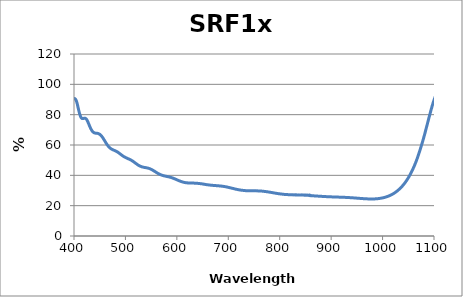
| Category | % Transmission |
|---|---|
| 1150.0 | 61.483 |
| 1149.5 | 62.046 |
| 1149.0 | 62.606 |
| 1148.5 | 63.166 |
| 1148.0 | 63.718 |
| 1147.5 | 64.289 |
| 1147.0 | 64.857 |
| 1146.5 | 65.485 |
| 1146.0 | 66.077 |
| 1145.5 | 66.648 |
| 1145.0 | 67.245 |
| 1144.5 | 67.798 |
| 1144.0 | 68.391 |
| 1143.5 | 69.008 |
| 1143.0 | 69.604 |
| 1142.5 | 70.252 |
| 1142.0 | 70.854 |
| 1141.5 | 71.463 |
| 1141.0 | 72.067 |
| 1140.5 | 72.682 |
| 1140.0 | 73.297 |
| 1139.5 | 73.929 |
| 1139.0 | 74.509 |
| 1138.5 | 75.114 |
| 1138.0 | 75.751 |
| 1137.5 | 76.386 |
| 1137.0 | 77.007 |
| 1136.5 | 77.647 |
| 1136.0 | 78.268 |
| 1135.5 | 78.894 |
| 1135.0 | 79.474 |
| 1134.5 | 80.083 |
| 1134.0 | 80.743 |
| 1133.5 | 81.38 |
| 1133.0 | 81.972 |
| 1132.5 | 82.528 |
| 1132.0 | 83.095 |
| 1131.5 | 83.683 |
| 1131.0 | 84.278 |
| 1130.5 | 84.891 |
| 1130.0 | 85.479 |
| 1129.5 | 86.086 |
| 1129.0 | 86.614 |
| 1128.5 | 87.114 |
| 1128.0 | 87.633 |
| 1127.5 | 88.16 |
| 1127.0 | 88.689 |
| 1126.5 | 89.2 |
| 1126.0 | 89.658 |
| 1125.5 | 90.138 |
| 1125.0 | 90.662 |
| 1124.5 | 91.08 |
| 1124.0 | 91.535 |
| 1123.5 | 91.955 |
| 1123.0 | 92.372 |
| 1122.5 | 92.743 |
| 1122.0 | 93.136 |
| 1121.5 | 93.522 |
| 1121.0 | 93.882 |
| 1120.5 | 94.209 |
| 1120.0 | 94.522 |
| 1119.5 | 94.811 |
| 1119.0 | 95.062 |
| 1118.5 | 95.298 |
| 1118.0 | 95.538 |
| 1117.5 | 95.748 |
| 1117.0 | 95.934 |
| 1116.5 | 96.098 |
| 1116.0 | 96.235 |
| 1115.5 | 96.375 |
| 1115.0 | 96.473 |
| 1114.5 | 96.544 |
| 1114.0 | 96.608 |
| 1113.5 | 96.643 |
| 1113.0 | 96.656 |
| 1112.5 | 96.654 |
| 1112.0 | 96.622 |
| 1111.5 | 96.563 |
| 1111.0 | 96.487 |
| 1110.5 | 96.387 |
| 1110.0 | 96.263 |
| 1109.5 | 96.121 |
| 1109.0 | 95.956 |
| 1108.5 | 95.777 |
| 1108.0 | 95.574 |
| 1107.5 | 95.315 |
| 1107.0 | 95.071 |
| 1106.5 | 94.773 |
| 1106.0 | 94.514 |
| 1105.5 | 94.202 |
| 1105.0 | 93.846 |
| 1104.5 | 93.486 |
| 1104.0 | 93.123 |
| 1103.5 | 92.746 |
| 1103.0 | 92.33 |
| 1102.5 | 91.899 |
| 1102.0 | 91.456 |
| 1101.5 | 91.019 |
| 1101.0 | 90.551 |
| 1100.5 | 90.062 |
| 1100.0 | 89.581 |
| 1099.5 | 89.076 |
| 1099.0 | 88.573 |
| 1098.5 | 88.05 |
| 1098.0 | 87.476 |
| 1097.5 | 86.889 |
| 1097.0 | 86.354 |
| 1096.5 | 85.806 |
| 1096.0 | 85.222 |
| 1095.5 | 84.561 |
| 1095.0 | 83.995 |
| 1094.5 | 83.414 |
| 1094.0 | 82.816 |
| 1093.5 | 82.166 |
| 1093.0 | 81.518 |
| 1092.5 | 80.899 |
| 1092.0 | 80.272 |
| 1091.5 | 79.584 |
| 1091.0 | 78.966 |
| 1090.5 | 78.34 |
| 1090.0 | 77.709 |
| 1089.5 | 77.054 |
| 1089.0 | 76.386 |
| 1088.5 | 75.737 |
| 1088.0 | 75.105 |
| 1087.5 | 74.449 |
| 1087.0 | 73.783 |
| 1086.5 | 73.09 |
| 1086.0 | 72.49 |
| 1085.5 | 71.854 |
| 1085.0 | 71.184 |
| 1084.5 | 70.537 |
| 1084.0 | 69.918 |
| 1083.5 | 69.277 |
| 1083.0 | 68.611 |
| 1082.5 | 67.911 |
| 1082.0 | 67.316 |
| 1081.5 | 66.663 |
| 1081.0 | 66.083 |
| 1080.5 | 65.461 |
| 1080.0 | 64.843 |
| 1079.5 | 64.258 |
| 1079.0 | 63.638 |
| 1078.5 | 63.035 |
| 1078.0 | 62.455 |
| 1077.5 | 61.885 |
| 1077.0 | 61.295 |
| 1076.5 | 60.745 |
| 1076.0 | 60.198 |
| 1075.5 | 59.623 |
| 1075.0 | 59.055 |
| 1074.5 | 58.522 |
| 1074.0 | 57.992 |
| 1073.5 | 57.431 |
| 1073.0 | 56.881 |
| 1072.5 | 56.372 |
| 1072.0 | 55.834 |
| 1071.5 | 55.286 |
| 1071.0 | 54.736 |
| 1070.5 | 54.273 |
| 1070.0 | 53.742 |
| 1069.5 | 53.201 |
| 1069.0 | 52.754 |
| 1068.5 | 52.254 |
| 1068.0 | 51.761 |
| 1067.5 | 51.297 |
| 1067.0 | 50.815 |
| 1066.5 | 50.338 |
| 1066.0 | 49.896 |
| 1065.5 | 49.423 |
| 1065.0 | 48.971 |
| 1064.5 | 48.564 |
| 1064.0 | 48.107 |
| 1063.5 | 47.691 |
| 1063.0 | 47.293 |
| 1062.5 | 46.861 |
| 1062.0 | 46.471 |
| 1061.5 | 46.044 |
| 1061.0 | 45.693 |
| 1060.5 | 45.309 |
| 1060.0 | 44.914 |
| 1059.5 | 44.554 |
| 1059.0 | 44.183 |
| 1058.5 | 43.805 |
| 1058.0 | 43.45 |
| 1057.5 | 43.104 |
| 1057.0 | 42.733 |
| 1056.5 | 42.374 |
| 1056.0 | 42.062 |
| 1055.5 | 41.718 |
| 1055.0 | 41.385 |
| 1054.5 | 41.065 |
| 1054.0 | 40.741 |
| 1053.5 | 40.412 |
| 1053.0 | 40.117 |
| 1052.5 | 39.817 |
| 1052.0 | 39.515 |
| 1051.5 | 39.226 |
| 1051.0 | 38.932 |
| 1050.5 | 38.642 |
| 1050.0 | 38.372 |
| 1049.5 | 38.096 |
| 1049.0 | 37.788 |
| 1048.5 | 37.549 |
| 1048.0 | 37.257 |
| 1047.5 | 36.998 |
| 1047.0 | 36.762 |
| 1046.5 | 36.489 |
| 1046.0 | 36.26 |
| 1045.5 | 36.016 |
| 1045.0 | 35.771 |
| 1044.5 | 35.529 |
| 1044.0 | 35.297 |
| 1043.5 | 35.063 |
| 1043.0 | 34.837 |
| 1042.5 | 34.612 |
| 1042.0 | 34.39 |
| 1041.5 | 34.178 |
| 1041.0 | 33.964 |
| 1040.5 | 33.742 |
| 1040.0 | 33.557 |
| 1039.5 | 33.355 |
| 1039.0 | 33.163 |
| 1038.5 | 32.965 |
| 1038.0 | 32.775 |
| 1037.5 | 32.591 |
| 1037.0 | 32.394 |
| 1036.5 | 32.23 |
| 1036.0 | 32.053 |
| 1035.5 | 31.883 |
| 1035.0 | 31.713 |
| 1034.5 | 31.547 |
| 1034.0 | 31.381 |
| 1033.5 | 31.215 |
| 1033.0 | 31.055 |
| 1032.5 | 30.895 |
| 1032.0 | 30.728 |
| 1031.5 | 30.575 |
| 1031.0 | 30.428 |
| 1030.5 | 30.279 |
| 1030.0 | 30.13 |
| 1029.5 | 29.989 |
| 1029.0 | 29.845 |
| 1028.5 | 29.692 |
| 1028.0 | 29.568 |
| 1027.5 | 29.433 |
| 1027.0 | 29.306 |
| 1026.5 | 29.178 |
| 1026.0 | 29.051 |
| 1025.5 | 28.927 |
| 1025.0 | 28.807 |
| 1024.5 | 28.686 |
| 1024.0 | 28.564 |
| 1023.5 | 28.459 |
| 1023.0 | 28.347 |
| 1022.5 | 28.239 |
| 1022.0 | 28.133 |
| 1021.5 | 28.027 |
| 1021.0 | 27.923 |
| 1020.5 | 27.821 |
| 1020.0 | 27.724 |
| 1019.5 | 27.627 |
| 1019.0 | 27.524 |
| 1018.5 | 27.436 |
| 1018.0 | 27.345 |
| 1017.5 | 27.257 |
| 1017.0 | 27.172 |
| 1016.5 | 27.083 |
| 1016.0 | 27.001 |
| 1015.5 | 26.915 |
| 1015.0 | 26.839 |
| 1014.5 | 26.754 |
| 1014.0 | 26.673 |
| 1013.5 | 26.603 |
| 1013.0 | 26.529 |
| 1012.5 | 26.457 |
| 1012.0 | 26.385 |
| 1011.5 | 26.313 |
| 1011.0 | 26.243 |
| 1010.5 | 26.184 |
| 1010.0 | 26.119 |
| 1009.5 | 26.056 |
| 1009.0 | 25.995 |
| 1008.5 | 25.935 |
| 1008.0 | 25.877 |
| 1007.5 | 25.818 |
| 1007.0 | 25.764 |
| 1006.5 | 25.7 |
| 1006.0 | 25.656 |
| 1005.5 | 25.6 |
| 1005.0 | 25.557 |
| 1004.5 | 25.503 |
| 1004.0 | 25.46 |
| 1003.5 | 25.408 |
| 1003.0 | 25.361 |
| 1002.5 | 25.32 |
| 1002.0 | 25.279 |
| 1001.5 | 25.24 |
| 1001.0 | 25.199 |
| 1000.5 | 25.161 |
| 1000.0 | 25.121 |
| 999.5 | 25.084 |
| 999.0 | 25.051 |
| 998.5 | 25.018 |
| 998.0 | 24.985 |
| 997.5 | 24.953 |
| 997.0 | 24.922 |
| 996.5 | 24.896 |
| 996.0 | 24.866 |
| 995.5 | 24.836 |
| 995.0 | 24.81 |
| 994.5 | 24.787 |
| 994.0 | 24.758 |
| 993.5 | 24.735 |
| 993.0 | 24.711 |
| 992.5 | 24.695 |
| 992.0 | 24.667 |
| 991.5 | 24.651 |
| 991.0 | 24.628 |
| 990.5 | 24.612 |
| 990.0 | 24.59 |
| 989.5 | 24.579 |
| 989.0 | 24.562 |
| 988.5 | 24.549 |
| 988.0 | 24.534 |
| 987.5 | 24.52 |
| 987.0 | 24.512 |
| 986.5 | 24.499 |
| 986.0 | 24.488 |
| 985.5 | 24.476 |
| 985.0 | 24.47 |
| 984.5 | 24.458 |
| 984.0 | 24.453 |
| 983.5 | 24.445 |
| 983.0 | 24.442 |
| 982.5 | 24.434 |
| 982.0 | 24.429 |
| 981.5 | 24.424 |
| 981.0 | 24.422 |
| 980.5 | 24.42 |
| 980.0 | 24.418 |
| 979.5 | 24.414 |
| 979.0 | 24.412 |
| 978.5 | 24.414 |
| 978.0 | 24.415 |
| 977.5 | 24.417 |
| 977.0 | 24.417 |
| 976.5 | 24.418 |
| 976.0 | 24.421 |
| 975.5 | 24.423 |
| 975.0 | 24.427 |
| 974.5 | 24.43 |
| 974.0 | 24.434 |
| 973.5 | 24.44 |
| 973.0 | 24.445 |
| 972.5 | 24.451 |
| 972.0 | 24.457 |
| 971.5 | 24.462 |
| 971.0 | 24.47 |
| 970.5 | 24.477 |
| 970.0 | 24.485 |
| 969.5 | 24.491 |
| 969.0 | 24.501 |
| 968.5 | 24.512 |
| 968.0 | 24.52 |
| 967.5 | 24.529 |
| 967.0 | 24.537 |
| 966.5 | 24.546 |
| 966.0 | 24.557 |
| 965.5 | 24.572 |
| 965.0 | 24.583 |
| 964.5 | 24.592 |
| 964.0 | 24.6 |
| 963.5 | 24.611 |
| 963.0 | 24.625 |
| 962.5 | 24.635 |
| 962.0 | 24.649 |
| 961.5 | 24.661 |
| 961.0 | 24.672 |
| 960.5 | 24.684 |
| 960.0 | 24.696 |
| 959.5 | 24.712 |
| 959.0 | 24.725 |
| 958.5 | 24.734 |
| 958.0 | 24.749 |
| 957.5 | 24.762 |
| 957.0 | 24.776 |
| 956.5 | 24.79 |
| 956.0 | 24.8 |
| 955.5 | 24.813 |
| 955.0 | 24.828 |
| 954.5 | 24.841 |
| 954.0 | 24.855 |
| 953.5 | 24.871 |
| 953.0 | 24.885 |
| 952.5 | 24.901 |
| 952.0 | 24.914 |
| 951.5 | 24.925 |
| 951.0 | 24.937 |
| 950.5 | 24.946 |
| 950.0 | 24.96 |
| 949.5 | 24.973 |
| 949.0 | 24.989 |
| 948.5 | 25.009 |
| 948.0 | 25.017 |
| 947.5 | 25.033 |
| 947.0 | 25.045 |
| 946.5 | 25.054 |
| 946.0 | 25.072 |
| 945.5 | 25.084 |
| 945.0 | 25.099 |
| 944.5 | 25.113 |
| 944.0 | 25.122 |
| 943.5 | 25.136 |
| 943.0 | 25.148 |
| 942.5 | 25.159 |
| 942.0 | 25.173 |
| 941.5 | 25.186 |
| 941.0 | 25.194 |
| 940.5 | 25.207 |
| 940.0 | 25.221 |
| 939.5 | 25.23 |
| 939.0 | 25.239 |
| 938.5 | 25.245 |
| 938.0 | 25.262 |
| 937.5 | 25.271 |
| 937.0 | 25.281 |
| 936.5 | 25.293 |
| 936.0 | 25.302 |
| 935.5 | 25.315 |
| 935.0 | 25.327 |
| 934.5 | 25.338 |
| 934.0 | 25.349 |
| 933.5 | 25.36 |
| 933.0 | 25.37 |
| 932.5 | 25.38 |
| 932.0 | 25.388 |
| 931.5 | 25.395 |
| 931.0 | 25.403 |
| 930.5 | 25.413 |
| 930.0 | 25.422 |
| 929.5 | 25.431 |
| 929.0 | 25.44 |
| 928.5 | 25.447 |
| 928.0 | 25.454 |
| 927.5 | 25.464 |
| 927.0 | 25.472 |
| 926.5 | 25.478 |
| 926.0 | 25.486 |
| 925.5 | 25.496 |
| 925.0 | 25.503 |
| 924.5 | 25.512 |
| 924.0 | 25.517 |
| 923.5 | 25.523 |
| 923.0 | 25.53 |
| 922.5 | 25.54 |
| 922.0 | 25.548 |
| 921.5 | 25.551 |
| 921.0 | 25.556 |
| 920.5 | 25.563 |
| 920.0 | 25.571 |
| 919.5 | 25.579 |
| 919.0 | 25.585 |
| 918.5 | 25.588 |
| 918.0 | 25.593 |
| 917.5 | 25.6 |
| 917.0 | 25.604 |
| 916.5 | 25.611 |
| 916.0 | 25.619 |
| 915.5 | 25.623 |
| 915.0 | 25.629 |
| 914.5 | 25.635 |
| 914.0 | 25.64 |
| 913.5 | 25.643 |
| 913.0 | 25.652 |
| 912.5 | 25.656 |
| 912.0 | 25.664 |
| 911.5 | 25.671 |
| 911.0 | 25.674 |
| 910.5 | 25.677 |
| 910.0 | 25.685 |
| 909.5 | 25.695 |
| 909.0 | 25.7 |
| 908.5 | 25.702 |
| 908.0 | 25.708 |
| 907.5 | 25.719 |
| 907.0 | 25.724 |
| 906.5 | 25.724 |
| 906.0 | 25.732 |
| 905.5 | 25.74 |
| 905.0 | 25.743 |
| 904.5 | 25.752 |
| 904.0 | 25.76 |
| 903.5 | 25.763 |
| 903.0 | 25.77 |
| 902.5 | 25.777 |
| 902.0 | 25.784 |
| 901.5 | 25.792 |
| 901.0 | 25.798 |
| 900.5 | 25.804 |
| 900.0 | 25.811 |
| 899.5 | 25.816 |
| 899.0 | 25.822 |
| 898.5 | 25.83 |
| 898.0 | 25.838 |
| 897.5 | 25.847 |
| 897.0 | 25.852 |
| 896.5 | 25.861 |
| 896.0 | 25.869 |
| 895.5 | 25.875 |
| 895.0 | 25.883 |
| 894.5 | 25.891 |
| 894.0 | 25.899 |
| 893.5 | 25.905 |
| 893.0 | 25.914 |
| 892.5 | 25.925 |
| 892.0 | 25.934 |
| 891.5 | 25.943 |
| 891.0 | 25.952 |
| 890.5 | 25.959 |
| 890.0 | 25.968 |
| 889.5 | 25.975 |
| 889.0 | 25.986 |
| 888.5 | 25.996 |
| 888.0 | 26.006 |
| 887.5 | 26.015 |
| 887.0 | 26.025 |
| 886.5 | 26.034 |
| 886.0 | 26.042 |
| 885.5 | 26.055 |
| 885.0 | 26.066 |
| 884.5 | 26.071 |
| 884.0 | 26.082 |
| 883.5 | 26.09 |
| 883.0 | 26.106 |
| 882.5 | 26.114 |
| 882.0 | 26.125 |
| 881.5 | 26.136 |
| 881.0 | 26.146 |
| 880.5 | 26.156 |
| 880.0 | 26.167 |
| 879.5 | 26.178 |
| 879.0 | 26.189 |
| 878.5 | 26.2 |
| 878.0 | 26.21 |
| 877.5 | 26.22 |
| 877.0 | 26.233 |
| 876.5 | 26.244 |
| 876.0 | 26.254 |
| 875.5 | 26.264 |
| 875.0 | 26.274 |
| 874.5 | 26.289 |
| 874.0 | 26.299 |
| 873.5 | 26.31 |
| 873.0 | 26.319 |
| 872.5 | 26.332 |
| 872.0 | 26.343 |
| 871.5 | 26.353 |
| 871.0 | 26.365 |
| 870.5 | 26.376 |
| 870.0 | 26.388 |
| 869.5 | 26.397 |
| 869.0 | 26.407 |
| 868.5 | 26.423 |
| 868.0 | 26.431 |
| 867.5 | 26.442 |
| 867.0 | 26.453 |
| 866.5 | 26.463 |
| 866.0 | 26.477 |
| 865.5 | 26.485 |
| 865.0 | 26.495 |
| 864.5 | 26.505 |
| 864.0 | 26.518 |
| 863.5 | 26.527 |
| 863.0 | 26.536 |
| 862.5 | 26.543 |
| 862.0 | 26.559 |
| 861.5 | 26.567 |
| 861.0 | 26.572 |
| 860.5 | 26.764 |
| 860.0 | 26.804 |
| 859.5 | 26.779 |
| 859.0 | 26.565 |
| 858.5 | 26.694 |
| 858.0 | 27.009 |
| 857.5 | 26.879 |
| 857.0 | 26.739 |
| 856.5 | 26.954 |
| 856.0 | 26.832 |
| 855.5 | 26.874 |
| 855.0 | 26.87 |
| 854.5 | 26.96 |
| 854.0 | 26.887 |
| 853.5 | 26.994 |
| 853.0 | 26.922 |
| 852.5 | 26.975 |
| 852.0 | 26.888 |
| 851.5 | 26.864 |
| 851.0 | 26.897 |
| 850.5 | 27.018 |
| 850.0 | 26.976 |
| 849.5 | 26.921 |
| 849.0 | 26.925 |
| 848.5 | 26.996 |
| 848.0 | 26.9 |
| 847.5 | 26.949 |
| 847.0 | 27.04 |
| 846.5 | 27.029 |
| 846.0 | 26.935 |
| 845.5 | 27.014 |
| 845.0 | 27.122 |
| 844.5 | 27.004 |
| 844.0 | 27.004 |
| 843.5 | 26.955 |
| 843.0 | 26.997 |
| 842.5 | 27.148 |
| 842.0 | 27.007 |
| 841.5 | 27.091 |
| 841.0 | 27.039 |
| 840.5 | 27.071 |
| 840.0 | 27.061 |
| 839.5 | 27.016 |
| 839.0 | 27.067 |
| 838.5 | 27.011 |
| 838.0 | 27.066 |
| 837.5 | 27.059 |
| 837.0 | 27.121 |
| 836.5 | 27.038 |
| 836.0 | 27.002 |
| 835.5 | 27.06 |
| 835.0 | 27.096 |
| 834.5 | 27.085 |
| 834.0 | 27.051 |
| 833.5 | 27.034 |
| 833.0 | 27.121 |
| 832.5 | 27.099 |
| 832.0 | 27.129 |
| 831.5 | 27.092 |
| 831.0 | 27.127 |
| 830.5 | 27.092 |
| 830.0 | 27.168 |
| 829.5 | 27.122 |
| 829.0 | 27.144 |
| 828.5 | 27.1 |
| 828.0 | 27.097 |
| 827.5 | 27.127 |
| 827.0 | 27.137 |
| 826.5 | 27.117 |
| 826.0 | 27.103 |
| 825.5 | 27.13 |
| 825.0 | 27.12 |
| 824.5 | 27.124 |
| 824.0 | 27.151 |
| 823.5 | 27.168 |
| 823.0 | 27.165 |
| 822.5 | 27.196 |
| 822.0 | 27.203 |
| 821.5 | 27.203 |
| 821.0 | 27.201 |
| 820.5 | 27.167 |
| 820.0 | 27.199 |
| 819.5 | 27.196 |
| 819.0 | 27.208 |
| 818.5 | 27.218 |
| 818.0 | 27.272 |
| 817.5 | 27.241 |
| 817.0 | 27.258 |
| 816.5 | 27.261 |
| 816.0 | 27.259 |
| 815.5 | 27.297 |
| 815.0 | 27.293 |
| 814.5 | 27.335 |
| 814.0 | 27.313 |
| 813.5 | 27.313 |
| 813.0 | 27.358 |
| 812.5 | 27.369 |
| 812.0 | 27.378 |
| 811.5 | 27.395 |
| 811.0 | 27.402 |
| 810.5 | 27.438 |
| 810.0 | 27.42 |
| 809.5 | 27.413 |
| 809.0 | 27.422 |
| 808.5 | 27.449 |
| 808.0 | 27.473 |
| 807.5 | 27.494 |
| 807.0 | 27.51 |
| 806.5 | 27.525 |
| 806.0 | 27.566 |
| 805.5 | 27.564 |
| 805.0 | 27.603 |
| 804.5 | 27.629 |
| 804.0 | 27.634 |
| 803.5 | 27.636 |
| 803.0 | 27.681 |
| 802.5 | 27.717 |
| 802.0 | 27.725 |
| 801.5 | 27.742 |
| 801.0 | 27.737 |
| 800.5 | 27.794 |
| 800.0 | 27.813 |
| 799.5 | 27.834 |
| 799.0 | 27.861 |
| 798.5 | 27.863 |
| 798.0 | 27.893 |
| 797.5 | 27.914 |
| 797.0 | 27.927 |
| 796.5 | 27.948 |
| 796.0 | 27.992 |
| 795.5 | 28.053 |
| 795.0 | 28.072 |
| 794.5 | 28.089 |
| 794.0 | 28.1 |
| 793.5 | 28.134 |
| 793.0 | 28.165 |
| 792.5 | 28.185 |
| 792.0 | 28.21 |
| 791.5 | 28.249 |
| 791.0 | 28.264 |
| 790.5 | 28.306 |
| 790.0 | 28.333 |
| 789.5 | 28.342 |
| 789.0 | 28.382 |
| 788.5 | 28.418 |
| 788.0 | 28.443 |
| 787.5 | 28.483 |
| 787.0 | 28.505 |
| 786.5 | 28.528 |
| 786.0 | 28.576 |
| 785.5 | 28.6 |
| 785.0 | 28.633 |
| 784.5 | 28.666 |
| 784.0 | 28.7 |
| 783.5 | 28.731 |
| 783.0 | 28.738 |
| 782.5 | 28.778 |
| 782.0 | 28.809 |
| 781.5 | 28.828 |
| 781.0 | 28.869 |
| 780.5 | 28.889 |
| 780.0 | 28.917 |
| 779.5 | 28.96 |
| 779.0 | 28.976 |
| 778.5 | 29.021 |
| 778.0 | 29.064 |
| 777.5 | 29.077 |
| 777.0 | 29.102 |
| 776.5 | 29.121 |
| 776.0 | 29.136 |
| 775.5 | 29.168 |
| 775.0 | 29.201 |
| 774.5 | 29.214 |
| 774.0 | 29.246 |
| 773.5 | 29.268 |
| 773.0 | 29.291 |
| 772.5 | 29.325 |
| 772.0 | 29.339 |
| 771.5 | 29.348 |
| 771.0 | 29.365 |
| 770.5 | 29.383 |
| 770.0 | 29.398 |
| 769.5 | 29.428 |
| 769.0 | 29.447 |
| 768.5 | 29.468 |
| 768.0 | 29.485 |
| 767.5 | 29.49 |
| 767.0 | 29.518 |
| 766.5 | 29.548 |
| 766.0 | 29.569 |
| 765.5 | 29.592 |
| 765.0 | 29.601 |
| 764.5 | 29.604 |
| 764.0 | 29.605 |
| 763.5 | 29.62 |
| 763.0 | 29.655 |
| 762.5 | 29.662 |
| 762.0 | 29.656 |
| 761.5 | 29.667 |
| 761.0 | 29.686 |
| 760.5 | 29.69 |
| 760.0 | 29.701 |
| 759.5 | 29.715 |
| 759.0 | 29.717 |
| 758.5 | 29.709 |
| 758.0 | 29.713 |
| 757.5 | 29.722 |
| 757.0 | 29.746 |
| 756.5 | 29.78 |
| 756.0 | 29.779 |
| 755.5 | 29.771 |
| 755.0 | 29.758 |
| 754.5 | 29.748 |
| 754.0 | 29.766 |
| 753.5 | 29.774 |
| 753.0 | 29.782 |
| 752.5 | 29.794 |
| 752.0 | 29.781 |
| 751.5 | 29.764 |
| 751.0 | 29.762 |
| 750.5 | 29.782 |
| 750.0 | 29.774 |
| 749.5 | 29.791 |
| 749.0 | 29.791 |
| 748.5 | 29.785 |
| 748.0 | 29.8 |
| 747.5 | 29.791 |
| 747.0 | 29.785 |
| 746.5 | 29.796 |
| 746.0 | 29.793 |
| 745.5 | 29.8 |
| 745.0 | 29.803 |
| 744.5 | 29.813 |
| 744.0 | 29.816 |
| 743.5 | 29.804 |
| 743.0 | 29.802 |
| 742.5 | 29.81 |
| 742.0 | 29.823 |
| 741.5 | 29.826 |
| 741.0 | 29.81 |
| 740.5 | 29.824 |
| 740.0 | 29.826 |
| 739.5 | 29.829 |
| 739.0 | 29.846 |
| 738.5 | 29.826 |
| 738.0 | 29.855 |
| 737.5 | 29.872 |
| 737.0 | 29.858 |
| 736.5 | 29.852 |
| 736.0 | 29.863 |
| 735.5 | 29.883 |
| 735.0 | 29.905 |
| 734.5 | 29.908 |
| 734.0 | 29.894 |
| 733.5 | 29.91 |
| 733.0 | 29.94 |
| 732.5 | 29.947 |
| 732.0 | 29.959 |
| 731.5 | 29.978 |
| 731.0 | 29.991 |
| 730.5 | 30.008 |
| 730.0 | 30.024 |
| 729.5 | 30.045 |
| 729.0 | 30.061 |
| 728.5 | 30.085 |
| 728.0 | 30.081 |
| 727.5 | 30.105 |
| 727.0 | 30.123 |
| 726.5 | 30.146 |
| 726.0 | 30.17 |
| 725.5 | 30.199 |
| 725.0 | 30.227 |
| 724.5 | 30.241 |
| 724.0 | 30.27 |
| 723.5 | 30.308 |
| 723.0 | 30.323 |
| 722.5 | 30.346 |
| 722.0 | 30.37 |
| 721.5 | 30.414 |
| 721.0 | 30.441 |
| 720.5 | 30.477 |
| 720.0 | 30.502 |
| 719.5 | 30.53 |
| 719.0 | 30.584 |
| 718.5 | 30.6 |
| 718.0 | 30.626 |
| 717.5 | 30.68 |
| 717.0 | 30.718 |
| 716.5 | 30.765 |
| 716.0 | 30.765 |
| 715.5 | 30.795 |
| 715.0 | 30.847 |
| 714.5 | 30.873 |
| 714.0 | 30.933 |
| 713.5 | 30.987 |
| 713.0 | 31.011 |
| 712.5 | 31.054 |
| 712.0 | 31.086 |
| 711.5 | 31.125 |
| 711.0 | 31.174 |
| 710.5 | 31.245 |
| 710.0 | 31.262 |
| 709.5 | 31.278 |
| 709.0 | 31.344 |
| 708.5 | 31.383 |
| 708.0 | 31.43 |
| 707.5 | 31.461 |
| 707.0 | 31.524 |
| 706.5 | 31.543 |
| 706.0 | 31.595 |
| 705.5 | 31.64 |
| 705.0 | 31.68 |
| 704.5 | 31.736 |
| 704.0 | 31.761 |
| 703.5 | 31.835 |
| 703.0 | 31.849 |
| 702.5 | 31.888 |
| 702.0 | 31.926 |
| 701.5 | 31.95 |
| 701.0 | 32.011 |
| 700.5 | 32.02 |
| 700.0 | 32.079 |
| 699.5 | 32.129 |
| 699.0 | 32.173 |
| 698.5 | 32.231 |
| 698.0 | 32.233 |
| 697.5 | 32.29 |
| 697.0 | 32.303 |
| 696.5 | 32.337 |
| 696.0 | 32.394 |
| 695.5 | 32.423 |
| 695.0 | 32.451 |
| 694.5 | 32.493 |
| 694.0 | 32.522 |
| 693.5 | 32.559 |
| 693.0 | 32.556 |
| 692.5 | 32.607 |
| 692.0 | 32.651 |
| 691.5 | 32.658 |
| 691.0 | 32.672 |
| 690.5 | 32.707 |
| 690.0 | 32.747 |
| 689.5 | 32.741 |
| 689.0 | 32.773 |
| 688.5 | 32.807 |
| 688.0 | 32.821 |
| 687.5 | 32.868 |
| 687.0 | 32.862 |
| 686.5 | 32.906 |
| 686.0 | 32.901 |
| 685.5 | 32.928 |
| 685.0 | 32.958 |
| 684.5 | 32.964 |
| 684.0 | 33.002 |
| 683.5 | 32.995 |
| 683.0 | 33.026 |
| 682.5 | 33.023 |
| 682.0 | 33.057 |
| 681.5 | 33.07 |
| 681.0 | 33.084 |
| 680.5 | 33.099 |
| 680.0 | 33.113 |
| 679.5 | 33.118 |
| 679.0 | 33.135 |
| 678.5 | 33.147 |
| 678.0 | 33.152 |
| 677.5 | 33.18 |
| 677.0 | 33.19 |
| 676.5 | 33.207 |
| 676.0 | 33.223 |
| 675.5 | 33.221 |
| 675.0 | 33.222 |
| 674.5 | 33.239 |
| 674.0 | 33.272 |
| 673.5 | 33.28 |
| 673.0 | 33.292 |
| 672.5 | 33.312 |
| 672.0 | 33.319 |
| 671.5 | 33.335 |
| 671.0 | 33.328 |
| 670.5 | 33.363 |
| 670.0 | 33.382 |
| 669.5 | 33.392 |
| 669.0 | 33.4 |
| 668.5 | 33.422 |
| 668.0 | 33.444 |
| 667.5 | 33.463 |
| 667.0 | 33.474 |
| 666.5 | 33.511 |
| 666.0 | 33.506 |
| 665.5 | 33.538 |
| 665.0 | 33.545 |
| 664.5 | 33.566 |
| 664.0 | 33.576 |
| 663.5 | 33.608 |
| 663.0 | 33.625 |
| 662.5 | 33.648 |
| 662.0 | 33.677 |
| 661.5 | 33.697 |
| 661.0 | 33.716 |
| 660.5 | 33.735 |
| 660.0 | 33.739 |
| 659.5 | 33.81 |
| 659.0 | 33.817 |
| 658.5 | 33.841 |
| 658.0 | 33.861 |
| 657.5 | 33.861 |
| 657.0 | 33.906 |
| 656.5 | 33.935 |
| 656.0 | 33.971 |
| 655.5 | 34.005 |
| 655.0 | 34.004 |
| 654.5 | 34.057 |
| 654.0 | 34.074 |
| 653.5 | 34.104 |
| 653.0 | 34.126 |
| 652.5 | 34.159 |
| 652.0 | 34.186 |
| 651.5 | 34.231 |
| 651.0 | 34.263 |
| 650.5 | 34.265 |
| 650.0 | 34.31 |
| 649.5 | 34.342 |
| 649.0 | 34.374 |
| 648.5 | 34.379 |
| 648.0 | 34.372 |
| 647.5 | 34.414 |
| 647.0 | 34.443 |
| 646.5 | 34.469 |
| 646.0 | 34.502 |
| 645.5 | 34.501 |
| 645.0 | 34.555 |
| 644.5 | 34.557 |
| 644.0 | 34.589 |
| 643.5 | 34.601 |
| 643.0 | 34.634 |
| 642.5 | 34.654 |
| 642.0 | 34.654 |
| 641.5 | 34.681 |
| 641.0 | 34.69 |
| 640.5 | 34.713 |
| 640.0 | 34.706 |
| 639.5 | 34.71 |
| 639.0 | 34.742 |
| 638.5 | 34.781 |
| 638.0 | 34.8 |
| 637.5 | 34.82 |
| 637.0 | 34.801 |
| 636.5 | 34.79 |
| 636.0 | 34.814 |
| 635.5 | 34.829 |
| 635.0 | 34.819 |
| 634.5 | 34.834 |
| 634.0 | 34.841 |
| 633.5 | 34.866 |
| 633.0 | 34.883 |
| 632.5 | 34.877 |
| 632.0 | 34.894 |
| 631.5 | 34.866 |
| 631.0 | 34.87 |
| 630.5 | 34.89 |
| 630.0 | 34.906 |
| 629.5 | 34.894 |
| 629.0 | 34.898 |
| 628.5 | 34.892 |
| 628.0 | 34.896 |
| 627.5 | 34.915 |
| 627.0 | 34.909 |
| 626.5 | 34.9 |
| 626.0 | 34.917 |
| 625.5 | 34.919 |
| 625.0 | 34.916 |
| 624.5 | 34.933 |
| 624.0 | 34.953 |
| 623.5 | 34.977 |
| 623.0 | 34.983 |
| 622.5 | 34.978 |
| 622.0 | 35.011 |
| 621.5 | 35.013 |
| 621.0 | 35.009 |
| 620.5 | 35.037 |
| 620.0 | 35.055 |
| 619.5 | 35.055 |
| 619.0 | 35.095 |
| 618.5 | 35.123 |
| 618.0 | 35.123 |
| 617.5 | 35.157 |
| 617.0 | 35.184 |
| 616.5 | 35.191 |
| 616.0 | 35.213 |
| 615.5 | 35.253 |
| 615.0 | 35.298 |
| 614.5 | 35.318 |
| 614.0 | 35.366 |
| 613.5 | 35.409 |
| 613.0 | 35.465 |
| 612.5 | 35.51 |
| 612.0 | 35.533 |
| 611.5 | 35.577 |
| 611.0 | 35.632 |
| 610.5 | 35.675 |
| 610.0 | 35.734 |
| 609.5 | 35.792 |
| 609.0 | 35.842 |
| 608.5 | 35.909 |
| 608.0 | 35.951 |
| 607.5 | 36.022 |
| 607.0 | 36.099 |
| 606.5 | 36.158 |
| 606.0 | 36.222 |
| 605.5 | 36.289 |
| 605.0 | 36.34 |
| 604.5 | 36.392 |
| 604.0 | 36.47 |
| 603.5 | 36.551 |
| 603.0 | 36.628 |
| 602.5 | 36.676 |
| 602.0 | 36.76 |
| 601.5 | 36.848 |
| 601.0 | 36.902 |
| 600.5 | 36.986 |
| 600.0 | 37.061 |
| 599.5 | 37.128 |
| 599.0 | 37.232 |
| 598.5 | 37.31 |
| 598.0 | 37.352 |
| 597.5 | 37.417 |
| 597.0 | 37.518 |
| 596.5 | 37.589 |
| 596.0 | 37.661 |
| 595.5 | 37.744 |
| 595.0 | 37.788 |
| 594.5 | 37.843 |
| 594.0 | 37.913 |
| 593.5 | 38.012 |
| 593.0 | 38.087 |
| 592.5 | 38.114 |
| 592.0 | 38.19 |
| 591.5 | 38.257 |
| 591.0 | 38.316 |
| 590.5 | 38.396 |
| 590.0 | 38.448 |
| 589.5 | 38.517 |
| 589.0 | 38.575 |
| 588.5 | 38.61 |
| 588.0 | 38.662 |
| 587.5 | 38.726 |
| 587.0 | 38.752 |
| 586.5 | 38.786 |
| 586.0 | 38.856 |
| 585.5 | 38.904 |
| 585.0 | 38.929 |
| 584.5 | 38.978 |
| 584.0 | 39.044 |
| 583.5 | 39.071 |
| 583.0 | 39.087 |
| 582.5 | 39.134 |
| 582.0 | 39.187 |
| 581.5 | 39.224 |
| 581.0 | 39.26 |
| 580.5 | 39.296 |
| 580.0 | 39.303 |
| 579.5 | 39.343 |
| 579.0 | 39.414 |
| 578.5 | 39.44 |
| 578.0 | 39.459 |
| 577.5 | 39.498 |
| 577.0 | 39.532 |
| 576.5 | 39.57 |
| 576.0 | 39.611 |
| 575.5 | 39.654 |
| 575.0 | 39.701 |
| 574.5 | 39.735 |
| 574.0 | 39.759 |
| 573.5 | 39.819 |
| 573.0 | 39.859 |
| 572.5 | 39.917 |
| 572.0 | 39.975 |
| 571.5 | 40.022 |
| 571.0 | 40.09 |
| 570.5 | 40.148 |
| 570.0 | 40.21 |
| 569.5 | 40.27 |
| 569.0 | 40.34 |
| 568.5 | 40.402 |
| 568.0 | 40.473 |
| 567.5 | 40.556 |
| 567.0 | 40.635 |
| 566.5 | 40.704 |
| 566.0 | 40.783 |
| 565.5 | 40.872 |
| 565.0 | 40.96 |
| 564.5 | 41.042 |
| 564.0 | 41.142 |
| 563.5 | 41.231 |
| 563.0 | 41.318 |
| 562.5 | 41.421 |
| 562.0 | 41.517 |
| 561.5 | 41.621 |
| 561.0 | 41.73 |
| 560.5 | 41.813 |
| 560.0 | 41.922 |
| 559.5 | 42.036 |
| 559.0 | 42.154 |
| 558.5 | 42.258 |
| 558.0 | 42.374 |
| 557.5 | 42.478 |
| 557.0 | 42.583 |
| 556.5 | 42.71 |
| 556.0 | 42.806 |
| 555.5 | 42.909 |
| 555.0 | 43.007 |
| 554.5 | 43.101 |
| 554.0 | 43.209 |
| 553.5 | 43.323 |
| 553.0 | 43.412 |
| 552.5 | 43.517 |
| 552.0 | 43.623 |
| 551.5 | 43.707 |
| 551.0 | 43.787 |
| 550.5 | 43.895 |
| 550.0 | 43.967 |
| 549.5 | 44.023 |
| 549.0 | 44.124 |
| 548.5 | 44.209 |
| 548.0 | 44.271 |
| 547.5 | 44.365 |
| 547.0 | 44.418 |
| 546.5 | 44.468 |
| 546.0 | 44.551 |
| 545.5 | 44.583 |
| 545.0 | 44.64 |
| 544.5 | 44.68 |
| 544.0 | 44.727 |
| 543.5 | 44.774 |
| 543.0 | 44.837 |
| 542.5 | 44.87 |
| 542.0 | 44.879 |
| 541.5 | 44.933 |
| 541.0 | 44.978 |
| 540.5 | 45.001 |
| 540.0 | 45.044 |
| 539.5 | 45.07 |
| 539.0 | 45.112 |
| 538.5 | 45.149 |
| 538.0 | 45.163 |
| 537.5 | 45.16 |
| 537.0 | 45.212 |
| 536.5 | 45.247 |
| 536.0 | 45.283 |
| 535.5 | 45.334 |
| 535.0 | 45.346 |
| 534.5 | 45.41 |
| 534.0 | 45.447 |
| 533.5 | 45.468 |
| 533.0 | 45.478 |
| 532.5 | 45.55 |
| 532.0 | 45.629 |
| 531.5 | 45.654 |
| 531.0 | 45.742 |
| 530.5 | 45.82 |
| 530.0 | 45.884 |
| 529.5 | 45.942 |
| 529.0 | 45.989 |
| 528.5 | 46.075 |
| 528.0 | 46.159 |
| 527.5 | 46.248 |
| 527.0 | 46.335 |
| 526.5 | 46.436 |
| 526.0 | 46.532 |
| 525.5 | 46.625 |
| 525.0 | 46.726 |
| 524.5 | 46.837 |
| 524.0 | 46.96 |
| 523.5 | 47.065 |
| 523.0 | 47.185 |
| 522.5 | 47.299 |
| 522.0 | 47.438 |
| 521.5 | 47.551 |
| 521.0 | 47.671 |
| 520.5 | 47.792 |
| 520.0 | 47.911 |
| 519.5 | 48.04 |
| 519.0 | 48.164 |
| 518.5 | 48.302 |
| 518.0 | 48.422 |
| 517.5 | 48.551 |
| 517.0 | 48.67 |
| 516.5 | 48.8 |
| 516.0 | 48.921 |
| 515.5 | 49.047 |
| 515.0 | 49.168 |
| 514.5 | 49.278 |
| 514.0 | 49.394 |
| 513.5 | 49.51 |
| 513.0 | 49.603 |
| 512.5 | 49.726 |
| 512.0 | 49.815 |
| 511.5 | 49.918 |
| 511.0 | 50.022 |
| 510.5 | 50.12 |
| 510.0 | 50.213 |
| 509.5 | 50.302 |
| 509.0 | 50.389 |
| 508.5 | 50.468 |
| 508.0 | 50.554 |
| 507.5 | 50.623 |
| 507.0 | 50.715 |
| 506.5 | 50.788 |
| 506.0 | 50.871 |
| 505.5 | 50.926 |
| 505.0 | 50.993 |
| 504.5 | 51.081 |
| 504.0 | 51.148 |
| 503.5 | 51.205 |
| 503.0 | 51.308 |
| 502.5 | 51.374 |
| 502.0 | 51.451 |
| 501.5 | 51.538 |
| 501.0 | 51.611 |
| 500.5 | 51.704 |
| 500.0 | 51.798 |
| 499.5 | 51.865 |
| 499.0 | 51.976 |
| 498.5 | 52.065 |
| 498.0 | 52.149 |
| 497.5 | 52.246 |
| 497.0 | 52.352 |
| 496.5 | 52.457 |
| 496.0 | 52.573 |
| 495.5 | 52.674 |
| 495.0 | 52.785 |
| 494.5 | 52.896 |
| 494.0 | 53.028 |
| 493.5 | 53.148 |
| 493.0 | 53.288 |
| 492.5 | 53.408 |
| 492.0 | 53.531 |
| 491.5 | 53.658 |
| 491.0 | 53.795 |
| 490.5 | 53.924 |
| 490.0 | 54.067 |
| 489.5 | 54.2 |
| 489.0 | 54.293 |
| 488.5 | 54.443 |
| 488.0 | 54.568 |
| 487.5 | 54.69 |
| 487.0 | 54.826 |
| 486.5 | 54.944 |
| 486.0 | 55.062 |
| 485.5 | 55.188 |
| 485.0 | 55.292 |
| 484.5 | 55.394 |
| 484.0 | 55.51 |
| 483.5 | 55.61 |
| 483.0 | 55.711 |
| 482.5 | 55.799 |
| 482.0 | 55.885 |
| 481.5 | 55.97 |
| 481.0 | 56.055 |
| 480.5 | 56.144 |
| 480.0 | 56.227 |
| 479.5 | 56.288 |
| 479.0 | 56.369 |
| 478.5 | 56.431 |
| 478.0 | 56.51 |
| 477.5 | 56.584 |
| 477.0 | 56.648 |
| 476.5 | 56.726 |
| 476.0 | 56.8 |
| 475.5 | 56.872 |
| 475.0 | 56.946 |
| 474.5 | 57.03 |
| 474.0 | 57.122 |
| 473.5 | 57.21 |
| 473.0 | 57.308 |
| 472.5 | 57.416 |
| 472.0 | 57.514 |
| 471.5 | 57.63 |
| 471.0 | 57.768 |
| 470.5 | 57.905 |
| 470.0 | 58.048 |
| 469.5 | 58.199 |
| 469.0 | 58.34 |
| 468.5 | 58.503 |
| 468.0 | 58.691 |
| 467.5 | 58.882 |
| 467.0 | 59.064 |
| 466.5 | 59.279 |
| 466.0 | 59.495 |
| 465.5 | 59.72 |
| 465.0 | 59.951 |
| 464.5 | 60.182 |
| 464.0 | 60.425 |
| 463.5 | 60.681 |
| 463.0 | 60.928 |
| 462.5 | 61.19 |
| 462.0 | 61.463 |
| 461.5 | 61.743 |
| 461.0 | 62.044 |
| 460.5 | 62.312 |
| 460.0 | 62.593 |
| 459.5 | 62.872 |
| 459.0 | 63.15 |
| 458.5 | 63.416 |
| 458.0 | 63.697 |
| 457.5 | 63.983 |
| 457.0 | 64.25 |
| 456.5 | 64.503 |
| 456.0 | 64.762 |
| 455.5 | 65.015 |
| 455.0 | 65.26 |
| 454.5 | 65.493 |
| 454.0 | 65.689 |
| 453.5 | 65.905 |
| 453.0 | 66.127 |
| 452.5 | 66.311 |
| 452.0 | 66.486 |
| 451.5 | 66.637 |
| 451.0 | 66.804 |
| 450.5 | 66.93 |
| 450.0 | 67.056 |
| 449.5 | 67.163 |
| 449.0 | 67.256 |
| 448.5 | 67.352 |
| 448.0 | 67.412 |
| 447.5 | 67.507 |
| 447.0 | 67.571 |
| 446.5 | 67.608 |
| 446.0 | 67.649 |
| 445.5 | 67.684 |
| 445.0 | 67.696 |
| 444.5 | 67.707 |
| 444.0 | 67.732 |
| 443.5 | 67.759 |
| 443.0 | 67.795 |
| 442.5 | 67.805 |
| 442.0 | 67.815 |
| 441.5 | 67.845 |
| 441.0 | 67.881 |
| 440.5 | 67.917 |
| 440.0 | 67.979 |
| 439.5 | 68.053 |
| 439.0 | 68.119 |
| 438.5 | 68.206 |
| 438.0 | 68.342 |
| 437.5 | 68.462 |
| 437.0 | 68.596 |
| 436.5 | 68.77 |
| 436.0 | 68.959 |
| 435.5 | 69.158 |
| 435.0 | 69.4 |
| 434.5 | 69.668 |
| 434.0 | 69.947 |
| 433.5 | 70.243 |
| 433.0 | 70.566 |
| 432.5 | 70.881 |
| 432.0 | 71.236 |
| 431.5 | 71.605 |
| 431.0 | 71.985 |
| 430.5 | 72.383 |
| 430.0 | 72.787 |
| 429.5 | 73.218 |
| 429.0 | 73.626 |
| 428.5 | 74.023 |
| 428.0 | 74.423 |
| 427.5 | 74.813 |
| 427.0 | 75.217 |
| 426.5 | 75.598 |
| 426.0 | 75.943 |
| 425.5 | 76.235 |
| 425.0 | 76.537 |
| 424.5 | 76.82 |
| 424.0 | 77.041 |
| 423.5 | 77.214 |
| 423.0 | 77.359 |
| 422.5 | 77.487 |
| 422.0 | 77.588 |
| 421.5 | 77.626 |
| 421.0 | 77.646 |
| 420.5 | 77.654 |
| 420.0 | 77.629 |
| 419.5 | 77.596 |
| 419.0 | 77.547 |
| 418.5 | 77.494 |
| 418.0 | 77.453 |
| 417.5 | 77.422 |
| 417.0 | 77.4 |
| 416.5 | 77.413 |
| 416.0 | 77.45 |
| 415.5 | 77.539 |
| 415.0 | 77.667 |
| 414.5 | 77.825 |
| 414.0 | 78.026 |
| 413.5 | 78.303 |
| 413.0 | 78.651 |
| 412.5 | 79.031 |
| 412.0 | 79.488 |
| 411.5 | 79.998 |
| 411.0 | 80.536 |
| 410.5 | 81.126 |
| 410.0 | 81.785 |
| 409.5 | 82.473 |
| 409.0 | 83.177 |
| 408.5 | 83.887 |
| 408.0 | 84.61 |
| 407.5 | 85.386 |
| 407.0 | 86.134 |
| 406.5 | 86.84 |
| 406.0 | 87.476 |
| 405.5 | 88.082 |
| 405.0 | 88.643 |
| 404.5 | 89.142 |
| 404.0 | 89.551 |
| 403.5 | 89.904 |
| 403.0 | 90.167 |
| 402.5 | 90.372 |
| 402.0 | 90.495 |
| 401.5 | 90.583 |
| 401.0 | 90.613 |
| 400.5 | 90.614 |
| 400.0 | 90.584 |
| 399.5 | 90.546 |
| 399.0 | 90.476 |
| 398.5 | 90.457 |
| 398.0 | 90.441 |
| 397.5 | 90.44 |
| 397.0 | 90.411 |
| 396.5 | 90.455 |
| 396.0 | 90.522 |
| 395.5 | 90.525 |
| 395.0 | 90.469 |
| 394.5 | 90.363 |
| 394.0 | 90.147 |
| 393.5 | 89.737 |
| 393.0 | 89.161 |
| 392.5 | 88.31 |
| 392.0 | 87.082 |
| 391.5 | 85.516 |
| 391.0 | 83.607 |
| 390.5 | 81.262 |
| 390.0 | 78.541 |
| 389.5 | 75.473 |
| 389.0 | 72.07 |
| 388.5 | 68.416 |
| 388.0 | 64.516 |
| 387.5 | 60.503 |
| 387.0 | 56.479 |
| 386.5 | 52.525 |
| 386.0 | 48.714 |
| 385.5 | 45.043 |
| 385.0 | 41.583 |
| 384.5 | 38.353 |
| 384.0 | 35.347 |
| 383.5 | 32.6 |
| 383.0 | 30.083 |
| 382.5 | 27.806 |
| 382.0 | 25.708 |
| 381.5 | 23.827 |
| 381.0 | 22.147 |
| 380.5 | 20.636 |
| 380.0 | 19.283 |
| 379.5 | 18.079 |
| 379.0 | 17.001 |
| 378.5 | 16.041 |
| 378.0 | 15.17 |
| 377.5 | 14.37 |
| 377.0 | 13.686 |
| 376.5 | 13.109 |
| 376.0 | 12.619 |
| 375.5 | 12.176 |
| 375.0 | 11.806 |
| 374.5 | 11.527 |
| 374.0 | 11.301 |
| 373.5 | 11.135 |
| 373.0 | 11.018 |
| 372.5 | 10.966 |
| 372.0 | 10.981 |
| 371.5 | 11.06 |
| 371.0 | 11.216 |
| 370.5 | 11.444 |
| 370.0 | 11.772 |
| 369.5 | 12.197 |
| 369.0 | 12.719 |
| 368.5 | 13.36 |
| 368.0 | 14.155 |
| 367.5 | 15.138 |
| 367.0 | 16.301 |
| 366.5 | 17.708 |
| 366.0 | 19.387 |
| 365.5 | 21.375 |
| 365.0 | 23.657 |
| 364.5 | 26.299 |
| 364.0 | 29.349 |
| 363.5 | 32.756 |
| 363.0 | 36.458 |
| 362.5 | 40.31 |
| 362.0 | 44.048 |
| 361.5 | 47.391 |
| 361.0 | 50.128 |
| 360.5 | 51.997 |
| 360.0 | 52.946 |
| 359.5 | 52.988 |
| 359.0 | 52.248 |
| 358.5 | 50.894 |
| 358.0 | 49.087 |
| 357.5 | 46.972 |
| 357.0 | 44.673 |
| 356.5 | 42.264 |
| 356.0 | 39.863 |
| 355.5 | 37.456 |
| 355.0 | 35.117 |
| 354.5 | 32.863 |
| 354.0 | 30.68 |
| 353.5 | 28.648 |
| 353.0 | 26.814 |
| 352.5 | 25.211 |
| 352.0 | 23.879 |
| 351.5 | 22.83 |
| 351.0 | 22.061 |
| 350.5 | 21.569 |
| 350.0 | 21.293 |